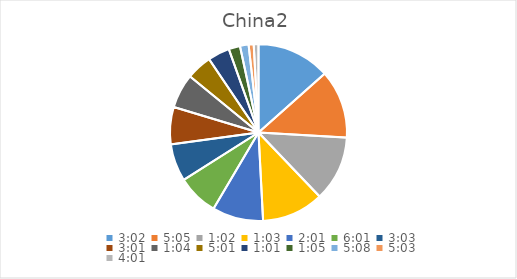
| Category | Series 0 |
|---|---|
| 0.12638888888888888 | 14.777 |
| 0.21180555555555555 | 13.758 |
| 0.04305555555555556 | 13.151 |
| 0.043750000000000004 | 12.445 |
| 0.08402777777777777 | 10.256 |
| 0.25069444444444444 | 8.27 |
| 0.12708333333333333 | 7.529 |
| 0.12569444444444444 | 7.506 |
| 0.044444444444444446 | 6.892 |
| 0.20902777777777778 | 5.115 |
| 0.042361111111111106 | 4.394 |
| 0.04513888888888889 | 2.289 |
| 0.2138888888888889 | 1.734 |
| 0.21041666666666667 | 1.016 |
| 0.1673611111111111 | 0.954 |